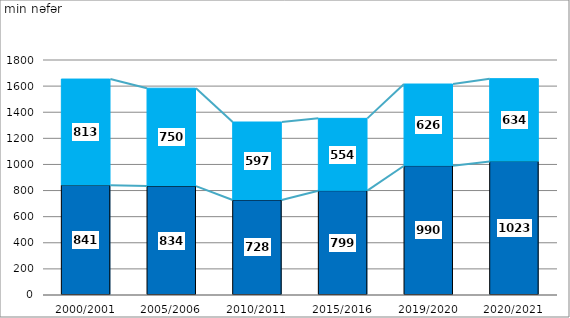
| Category |     şəhər   urban   |     kənd   rural    |
|---|---|---|
| 2000/2001 | 841 | 813 |
| 2005/2006 | 834 | 750 |
| 2010/2011 | 728 | 597 |
| 2015/2016 | 799 | 554 |
| 2019/2020 | 990 | 626 |
| 2020/2021 | 1023 | 634 |